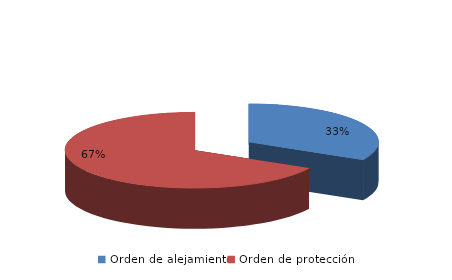
| Category | Series 0 |
|---|---|
| Orden de alejamiento | 370 |
| Orden de protección | 757 |